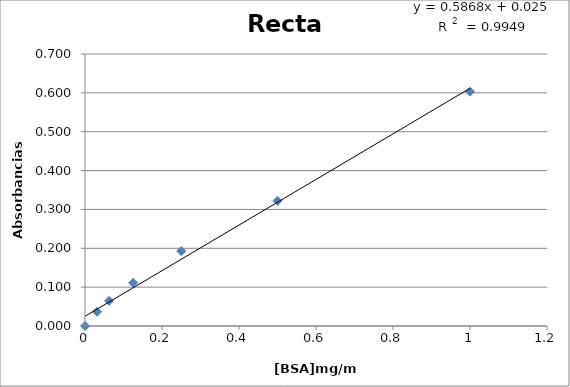
| Category | Series 0 |
|---|---|
| 1.0 | 0.603 |
| 0.5 | 0.322 |
| 0.25 | 0.193 |
| 0.125 | 0.111 |
| 0.0625 | 0.065 |
| 0.03125 | 0.037 |
| 0.0 | 0 |